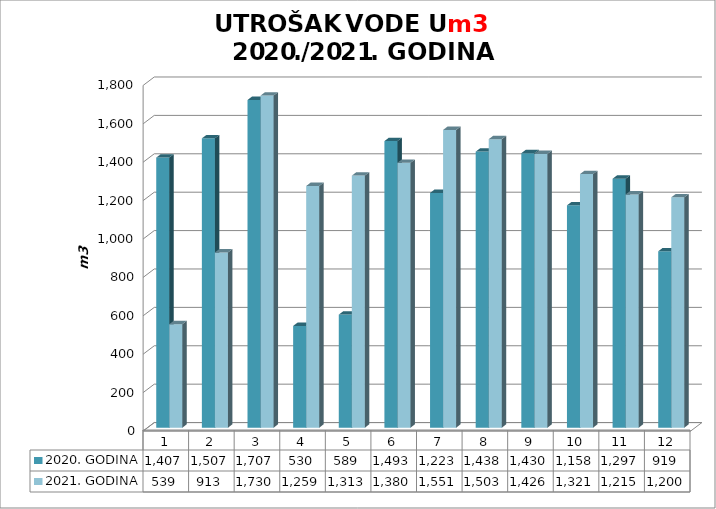
| Category | 2020. GODINA | 2021. GODINA |
|---|---|---|
| 0 | 1407 | 539 |
| 1 | 1507 | 913 |
| 2 | 1707 | 1730 |
| 3 | 530 | 1259 |
| 4 | 589 | 1313 |
| 5 | 1493 | 1380 |
| 6 | 1223 | 1551 |
| 7 | 1438 | 1503 |
| 8 | 1430 | 1426 |
| 9 | 1158 | 1321 |
| 10 | 1297 | 1215 |
| 11 | 919 | 1200 |